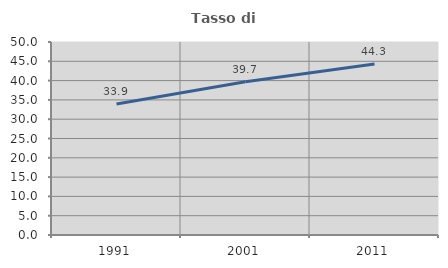
| Category | Tasso di occupazione   |
|---|---|
| 1991.0 | 33.934 |
| 2001.0 | 39.701 |
| 2011.0 | 44.318 |